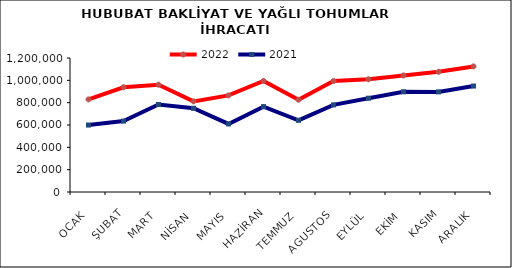
| Category | 2022 | 2021 |
|---|---|---|
| OCAK | 829294.473 | 599472.627 |
| ŞUBAT | 938161.198 | 635152.719 |
| MART | 960871.339 | 783752.092 |
| NİSAN | 811739.152 | 749920.668 |
| MAYIS | 865030.042 | 609595.606 |
| HAZİRAN | 994788.242 | 764393.561 |
| TEMMUZ | 826260.724 | 641900.726 |
| AGUSTOS | 993496.101 | 780012.623 |
| EYLÜL | 1009652.371 | 840003.3 |
| EKİM | 1043565.643 | 897190.438 |
| KASIM | 1076113.181 | 896591.608 |
| ARALIK | 1124775.462 | 948837.252 |